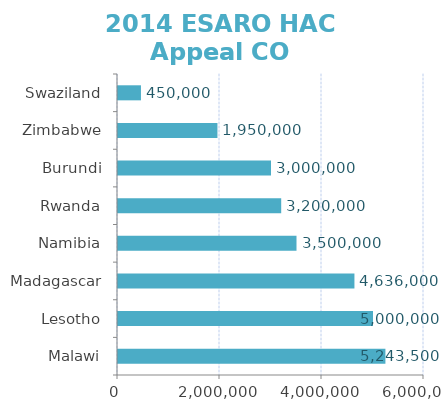
| Category | 2014 HAC requirements (US$) |
|---|---|
| Malawi | 5243500 |
| Lesotho | 5000000 |
| Madagascar | 4636000 |
| Namibia | 3500000 |
| Rwanda | 3200000 |
| Burundi | 3000000 |
| Zimbabwe | 1950000 |
| Swaziland | 450000 |